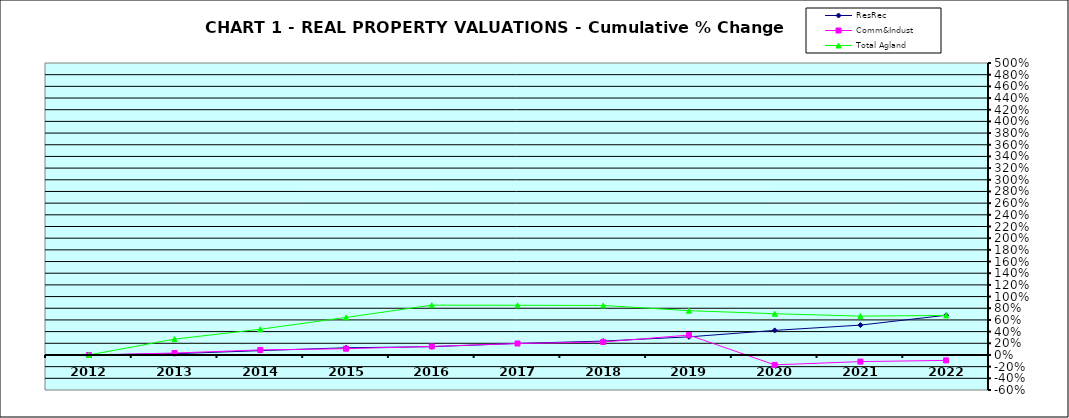
| Category | ResRec | Comm&Indust | Total Agland |
|---|---|---|---|
| 2012.0 | 0 | 0 | 0 |
| 2013.0 | 0.022 | 0.033 | 0.271 |
| 2014.0 | 0.074 | 0.087 | 0.441 |
| 2015.0 | 0.123 | 0.107 | 0.642 |
| 2016.0 | 0.141 | 0.146 | 0.853 |
| 2017.0 | 0.197 | 0.196 | 0.851 |
| 2018.0 | 0.238 | 0.222 | 0.848 |
| 2019.0 | 0.31 | 0.341 | 0.759 |
| 2020.0 | 0.421 | -0.169 | 0.706 |
| 2021.0 | 0.511 | -0.114 | 0.665 |
| 2022.0 | 0.68 | -0.093 | 0.677 |